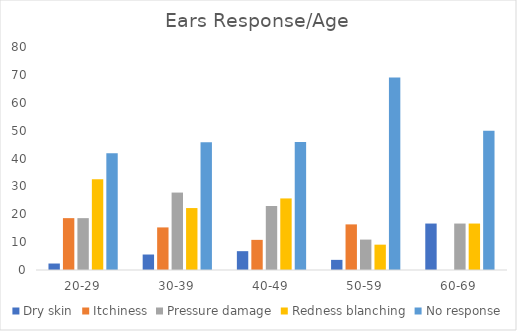
| Category | Dry skin | Itchiness | Pressure damage | Redness blanching | No response |
|---|---|---|---|---|---|
| 20-29 | 2.326 | 18.605 | 18.605 | 32.558 | 41.86 |
| 30-39 | 5.556 | 15.278 | 27.778 | 22.222 | 45.833 |
| 40-49 | 6.757 | 10.811 | 22.973 | 25.676 | 45.946 |
| 50-59 | 3.636 | 16.364 | 10.909 | 9.091 | 69.091 |
| 60-69 | 16.667 | 0 | 16.667 | 16.667 | 50 |